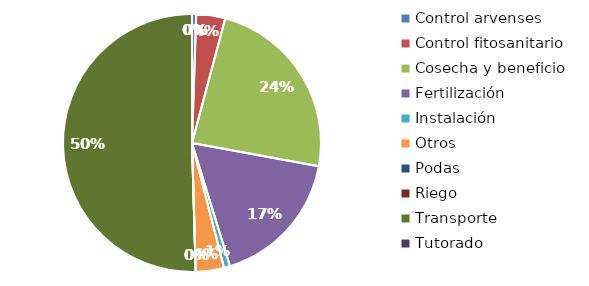
| Category | Valor |
|---|---|
| Control arvenses | 225000 |
| Control fitosanitario | 1569950 |
| Cosecha y beneficio | 10260000 |
| Fertilización | 7504002 |
| Instalación | 330000 |
| Otros | 1530000 |
| Podas | 0 |
| Riego | 0 |
| Transporte | 21817250 |
| Tutorado | 0 |